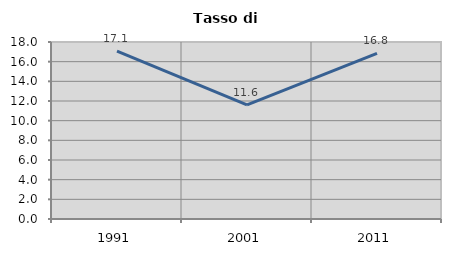
| Category | Tasso di disoccupazione   |
|---|---|
| 1991.0 | 17.073 |
| 2001.0 | 11.597 |
| 2011.0 | 16.837 |